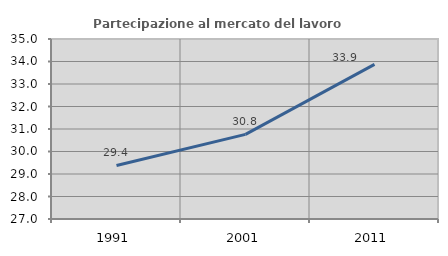
| Category | Partecipazione al mercato del lavoro  femminile |
|---|---|
| 1991.0 | 29.379 |
| 2001.0 | 30.763 |
| 2011.0 | 33.873 |